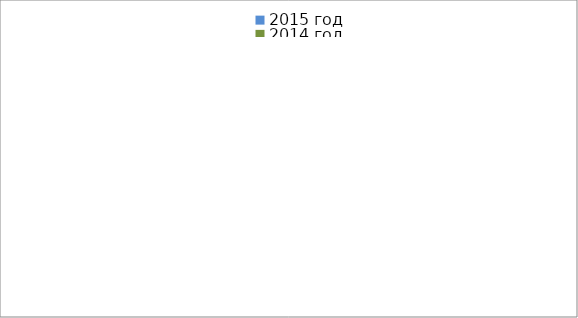
| Category | 2015 год | 2014 год |
|---|---|---|
|  - поджог | 2 | 4 |
|  - неосторожное обращение с огнём | 26 | 14 |
|  - НПТЭ электрооборудования | 7 | 10 |
|  - НПУ и Э печей | 25 | 32 |
|  - НПУ и Э транспортных средств | 30 | 34 |
|   -Шалость с огнем детей | 1 | 0 |
|  -НППБ при эксплуатации эл.приборов | 10 | 11 |
|  - курение | 9 | 9 |
| - прочие | 48 | 48 |
| - не установленные причины | 3 | 6 |